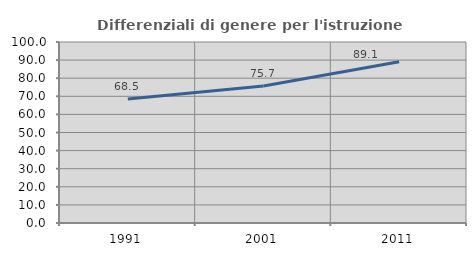
| Category | Differenziali di genere per l'istruzione superiore |
|---|---|
| 1991.0 | 68.484 |
| 2001.0 | 75.706 |
| 2011.0 | 89.125 |